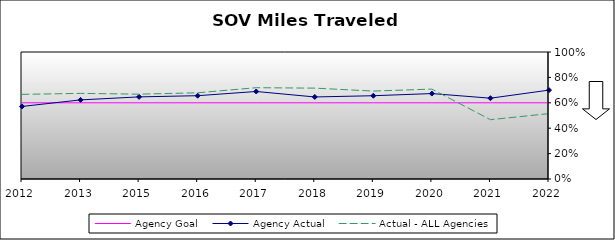
| Category | Agency Goal | Agency Actual | Actual - ALL Agencies |
|---|---|---|---|
| 2012.0 | 0.6 | 0.571 | 0.666 |
| 2013.0 | 0.6 | 0.623 | 0.674 |
| 2015.0 | 0.6 | 0.647 | 0.668 |
| 2016.0 | 0.6 | 0.656 | 0.679 |
| 2017.0 | 0.6 | 0.689 | 0.719 |
| 2018.0 | 0.6 | 0.646 | 0.715 |
| 2019.0 | 0.6 | 0.656 | 0.692 |
| 2020.0 | 0.6 | 0.673 | 0.708 |
| 2021.0 | 0.6 | 0.636 | 0.467 |
| 2022.0 | 0.6 | 0.7 | 0.515 |